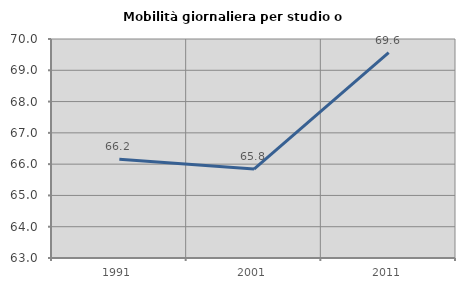
| Category | Mobilità giornaliera per studio o lavoro |
|---|---|
| 1991.0 | 66.154 |
| 2001.0 | 65.842 |
| 2011.0 | 69.563 |